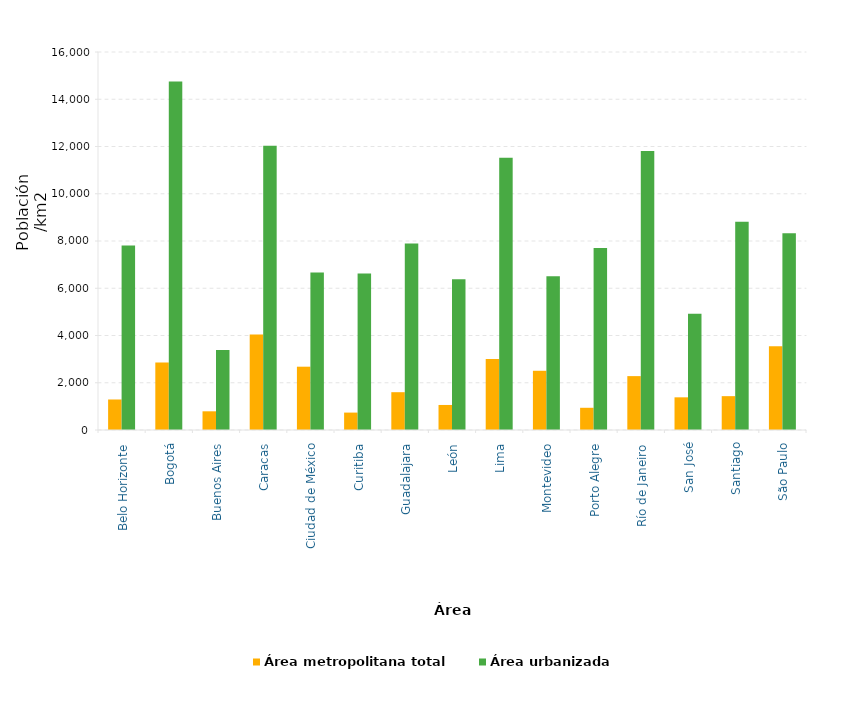
| Category | Área metropolitana total | Área urbanizada |
|---|---|---|
| _x000e_Belo Horizonte | 1291.57 | 7812.282 |
| _x0006_Bogotá | 2860.553 | 14754.854 |
| _x000c_Buenos Aires | 791.126 | 3388.206 |
| _x0007_Caracas | 4041.282 | 12029.951 |
| _x0010_Ciudad de México | 2679.653 | 6671.259 |
| _x0008_Curitiba | 736.976 | 6623.77 |
| _x000b_Guadalajara | 1600.117 | 7896.302 |
| _x0004_León | 1059.53 | 6381.92 |
| _x0004_Lima | 3009.088 | 11527.803 |
| 
Montevideo | 2506.556 | 6508.629 |
| _x000c_Porto Alegre | 940.326 | 7701.88 |
| _x000e_Río de Janeiro | 2280.893 | 11812.536 |
| _x0008_San José | 1382.728 | 4924.396 |
| _x0008_Santiago | 1432.631 | 8813.878 |
| 	São Paulo | 3542.96 | 8333.172 |